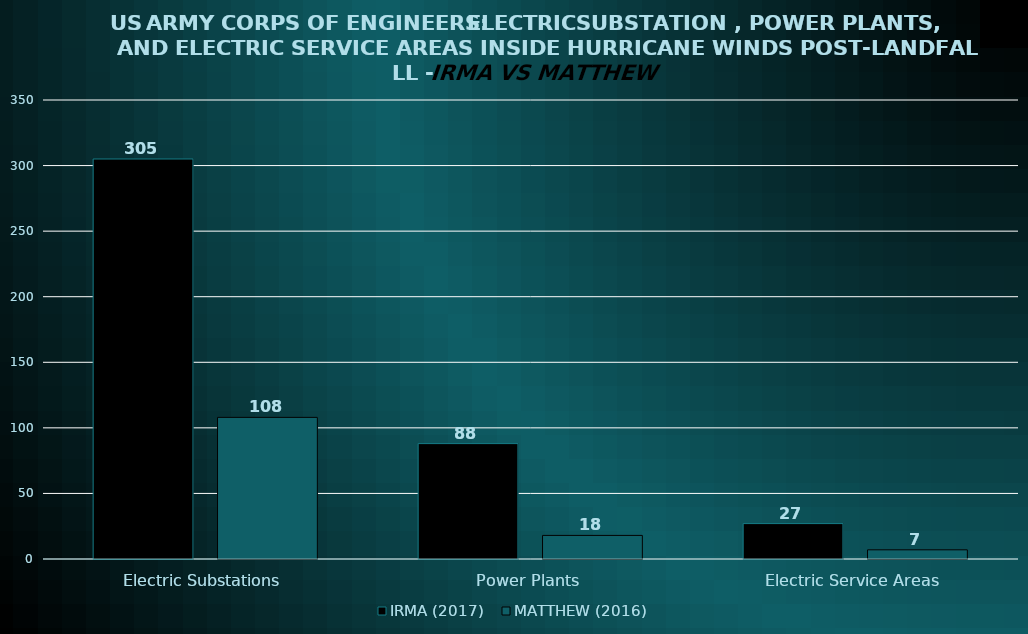
| Category | IRMA (2017) | MATTHEW (2016) |
|---|---|---|
| Electric Substations | 305 | 108 |
| Power Plants | 88 | 18 |
| Electric Service Areas | 27 | 7 |